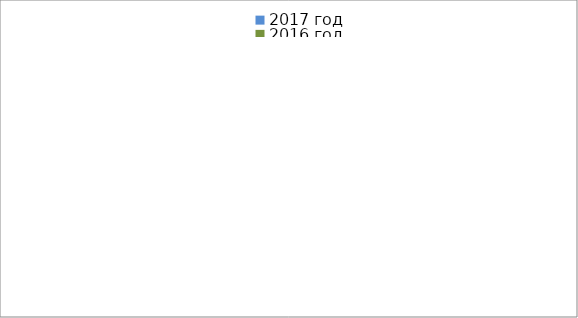
| Category | 2017 год | 2016 год |
|---|---|---|
|  - поджог | 2 | 4 |
|  - неосторожное обращение с огнём | 1 | 0 |
|  - НПТЭ электрооборудования | 4 | 1 |
|  - НПУ и Э печей | 17 | 14 |
|  - НПУ и Э транспортных средств | 15 | 17 |
|   -Шалость с огнем детей | 1 | 0 |
|  -НППБ при эксплуатации эл.приборов | 12 | 12 |
|  - курение | 9 | 3 |
| - прочие | 8 | 20 |
| - не установленные причины | 0 | 0 |